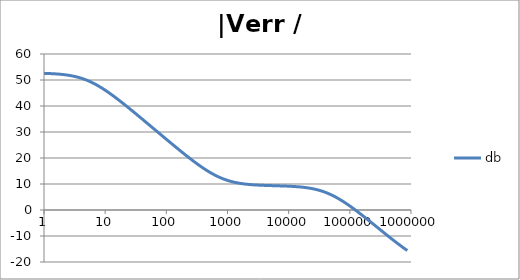
| Category | db |
|---|---|
| 1.0 | 52.556 |
| 1.0715193052376064 | 52.534 |
| 1.1481536214968828 | 52.508 |
| 1.2302687708123814 | 52.479 |
| 1.318256738556407 | 52.446 |
| 1.4125375446227544 | 52.408 |
| 1.513561248436208 | 52.365 |
| 1.6218100973589298 | 52.317 |
| 1.7378008287493754 | 52.261 |
| 1.8620871366628673 | 52.199 |
| 1.9952623149688797 | 52.128 |
| 2.1379620895022318 | 52.048 |
| 2.2908676527677727 | 51.958 |
| 2.45470891568503 | 51.857 |
| 2.6302679918953817 | 51.744 |
| 2.8183829312644537 | 51.617 |
| 3.0199517204020156 | 51.476 |
| 3.235936569296282 | 51.32 |
| 3.467368504525316 | 51.148 |
| 3.7153522909717256 | 50.957 |
| 3.9810717055349727 | 50.749 |
| 4.265795188015926 | 50.521 |
| 4.570881896148749 | 50.274 |
| 4.897788193684462 | 50.006 |
| 5.2480746024977245 | 49.717 |
| 5.62341325190349 | 49.408 |
| 6.025595860743575 | 49.079 |
| 6.456542290346554 | 48.729 |
| 6.918309709189363 | 48.359 |
| 7.4131024130091765 | 47.97 |
| 7.943282347242814 | 47.562 |
| 8.511380382023765 | 47.137 |
| 9.120108393559095 | 46.695 |
| 9.772372209558105 | 46.238 |
| 10.47128548050899 | 45.766 |
| 11.22018454301963 | 45.281 |
| 12.022644346174127 | 44.783 |
| 12.88249551693134 | 44.275 |
| 13.803842646028851 | 43.756 |
| 14.791083881682074 | 43.228 |
| 15.848931924611136 | 42.692 |
| 16.98243652461744 | 42.148 |
| 18.197008586099834 | 41.598 |
| 19.498445997580447 | 41.042 |
| 20.892961308540382 | 40.481 |
| 22.387211385683386 | 39.915 |
| 23.988329190194897 | 39.345 |
| 25.703957827688622 | 38.771 |
| 27.54228703338165 | 38.195 |
| 29.51209226666385 | 37.615 |
| 31.62277660168379 | 37.034 |
| 33.884415613920254 | 36.45 |
| 36.307805477010106 | 35.864 |
| 38.90451449942804 | 35.277 |
| 41.686938347033525 | 34.689 |
| 44.6683592150963 | 34.1 |
| 47.86300923226381 | 33.51 |
| 51.28613839913647 | 32.919 |
| 54.95408738576247 | 32.327 |
| 58.88436553555889 | 31.736 |
| 63.09573444801931 | 31.144 |
| 67.60829753919813 | 30.552 |
| 72.44359600749901 | 29.96 |
| 77.62471166286915 | 29.369 |
| 83.17637711026705 | 28.778 |
| 89.12509381337456 | 28.187 |
| 95.49925860214357 | 27.597 |
| 102.32929922807544 | 27.009 |
| 109.64781961431841 | 26.421 |
| 117.48975549395293 | 25.835 |
| 125.89254117941665 | 25.251 |
| 134.89628825916537 | 24.668 |
| 144.54397707459273 | 24.088 |
| 154.88166189124806 | 23.51 |
| 165.95869074375608 | 22.935 |
| 177.82794100389225 | 22.364 |
| 190.5460717963248 | 21.796 |
| 204.17379446695278 | 21.233 |
| 218.77616239495524 | 20.675 |
| 234.42288153199212 | 20.122 |
| 251.18864315095806 | 19.576 |
| 269.15348039269156 | 19.036 |
| 288.4031503126605 | 18.505 |
| 309.0295432513591 | 17.982 |
| 331.1311214825911 | 17.47 |
| 354.81338923357566 | 16.968 |
| 380.18939632056095 | 16.477 |
| 407.3802778041123 | 16 |
| 436.5158322401654 | 15.537 |
| 467.7351412871979 | 15.089 |
| 501.18723362727184 | 14.657 |
| 537.0317963702526 | 14.242 |
| 575.4399373371566 | 13.845 |
| 616.5950018614822 | 13.467 |
| 660.6934480075952 | 13.109 |
| 707.9457843841375 | 12.771 |
| 758.5775750291831 | 12.453 |
| 812.8305161640983 | 12.157 |
| 870.9635899560801 | 11.88 |
| 933.2543007969903 | 11.625 |
| 999.9999999999998 | 11.389 |
| 1071.5193052376057 | 11.172 |
| 1148.1536214968828 | 10.975 |
| 1230.2687708123801 | 10.795 |
| 1318.2567385564053 | 10.631 |
| 1412.537544622753 | 10.484 |
| 1513.5612484362066 | 10.351 |
| 1621.8100973589292 | 10.232 |
| 1737.8008287493742 | 10.125 |
| 1862.0871366628671 | 10.03 |
| 1995.2623149688786 | 9.945 |
| 2137.9620895022326 | 9.87 |
| 2290.867652767771 | 9.802 |
| 2454.708915685027 | 9.742 |
| 2630.26799189538 | 9.689 |
| 2818.382931264451 | 9.642 |
| 3019.9517204020176 | 9.599 |
| 3235.9365692962774 | 9.562 |
| 3467.368504525316 | 9.528 |
| 3715.352290971724 | 9.497 |
| 3981.07170553497 | 9.469 |
| 4265.795188015923 | 9.443 |
| 4570.881896148745 | 9.419 |
| 4897.788193684463 | 9.397 |
| 5248.074602497726 | 9.375 |
| 5623.413251903489 | 9.355 |
| 6025.595860743574 | 9.334 |
| 6456.54229034655 | 9.313 |
| 6918.309709189357 | 9.292 |
| 7413.102413009165 | 9.27 |
| 7943.282347242815 | 9.246 |
| 8511.380382023763 | 9.221 |
| 9120.108393559092 | 9.194 |
| 9772.3722095581 | 9.164 |
| 10471.285480509003 | 9.131 |
| 11220.184543019639 | 9.095 |
| 12022.64434617411 | 9.054 |
| 12882.495516931338 | 9.008 |
| 13803.842646028841 | 8.956 |
| 14791.083881682063 | 8.898 |
| 15848.931924611119 | 8.833 |
| 16982.436524617453 | 8.76 |
| 18197.008586099837 | 8.678 |
| 19498.445997580417 | 8.586 |
| 20892.961308540387 | 8.483 |
| 22387.211385683382 | 8.367 |
| 23988.32919019488 | 8.239 |
| 25703.957827688606 | 8.096 |
| 27542.28703338167 | 7.937 |
| 29512.092266663854 | 7.762 |
| 31622.77660168378 | 7.57 |
| 33884.41561392023 | 7.359 |
| 36307.805477010166 | 7.129 |
| 38904.514499428085 | 6.879 |
| 41686.93834703348 | 6.609 |
| 44668.35921509631 | 6.318 |
| 47863.00923226382 | 6.007 |
| 51286.13839913646 | 5.675 |
| 54954.08738576241 | 5.323 |
| 58884.365535558936 | 4.952 |
| 63095.73444801934 | 4.561 |
| 67608.29753919817 | 4.152 |
| 72443.59600749899 | 3.725 |
| 77624.71166286913 | 3.283 |
| 83176.37711026703 | 2.825 |
| 89125.09381337445 | 2.353 |
| 95499.25860214363 | 1.867 |
| 102329.29922807543 | 1.37 |
| 109647.81961431848 | 0.862 |
| 117489.75549395289 | 0.345 |
| 125892.54117941685 | -0.182 |
| 134896.28825916522 | -0.716 |
| 144543.97707459255 | -1.257 |
| 154881.66189124787 | -1.804 |
| 165958.69074375575 | -2.357 |
| 177827.9410038922 | -2.913 |
| 190546.07179632425 | -3.474 |
| 204173.79446695274 | -4.038 |
| 218776.16239495497 | -4.604 |
| 234422.88153199226 | -5.173 |
| 251188.64315095753 | -5.743 |
| 269153.480392691 | -6.313 |
| 288403.15031266044 | -6.884 |
| 309029.5432513582 | -7.455 |
| 331131.1214825907 | -8.026 |
| 354813.3892335749 | -8.595 |
| 380189.3963205612 | -9.162 |
| 407380.2778041119 | -9.727 |
| 436515.8322401649 | -10.29 |
| 467735.14128719777 | -10.848 |
| 501187.2336272717 | -11.403 |
| 537031.7963702519 | -11.953 |
| 575439.9373371559 | -12.497 |
| 616595.001861482 | -13.035 |
| 660693.4480075944 | -13.565 |
| 707945.7843841374 | -14.087 |
| 758577.575029183 | -14.6 |
| 812830.5161640996 | -15.103 |
| 870963.5899560791 | -15.594 |